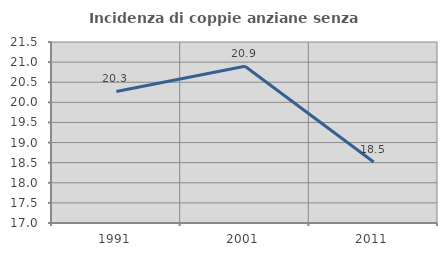
| Category | Incidenza di coppie anziane senza figli  |
|---|---|
| 1991.0 | 20.27 |
| 2001.0 | 20.896 |
| 2011.0 | 18.519 |